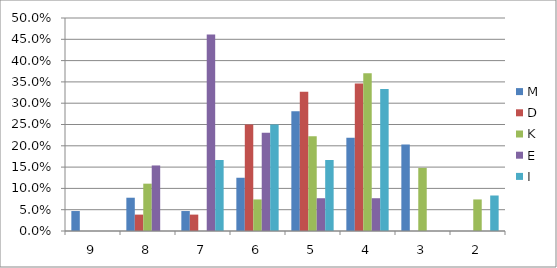
| Category | M | D | K | E | I | R |
|---|---|---|---|---|---|---|
| 9.0 | 0.047 | 0 | 0 | 0 | 0 |  |
| 8.0 | 0.078 | 0.038 | 0.111 | 0.154 | 0 |  |
| 7.0 | 0.047 | 0.038 | 0 | 0.462 | 0.167 |  |
| 6.0 | 0.125 | 0.25 | 0.074 | 0.231 | 0.25 |  |
| 5.0 | 0.281 | 0.327 | 0.222 | 0.077 | 0.167 |  |
| 4.0 | 0.219 | 0.346 | 0.37 | 0.077 | 0.333 |  |
| 3.0 | 0.203 | 0 | 0.148 | 0 | 0 |  |
| 2.0 | 0 | 0 | 0.074 | 0 | 0.083 |  |